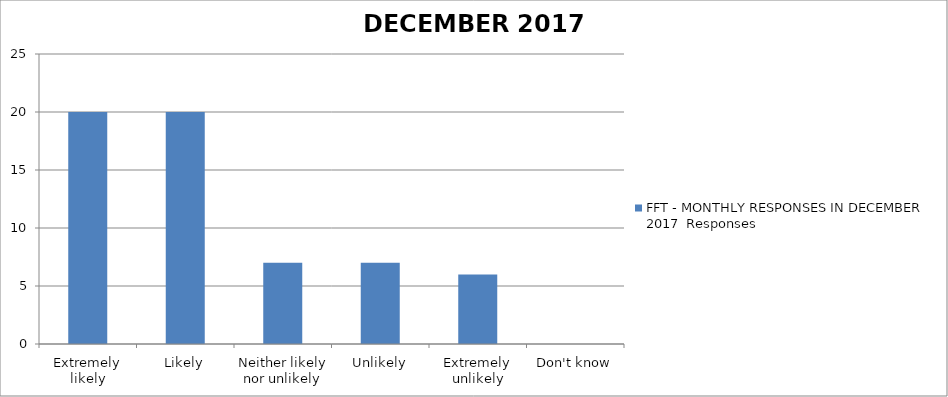
| Category | FFT - MONTHLY RESPONSES IN DECEMBER 2017 |
|---|---|
| Extremely likely | 20 |
| Likely | 20 |
| Neither likely nor unlikely | 7 |
| Unlikely | 7 |
| Extremely unlikely | 6 |
| Don't know | 0 |